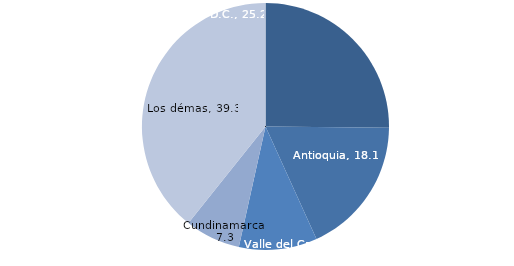
| Category | Series 0 |
|---|---|
| Bogotá D.C. | 25.172 |
| Antioquia | 18.053 |
| Valle del Cauca | 10.242 |
| Cundinamarca | 7.26 |
| Los démas | 39.273 |